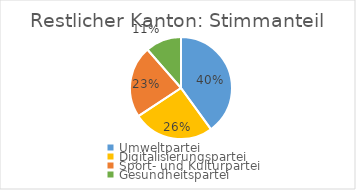
| Category | Stimmanteil |
|---|---|
| Umweltpartei | 0.4 |
| Digitalisierungspartei | 0.257 |
| Sport- und Kulturpartei | 0.229 |
| Gesundheitspartei | 0.114 |